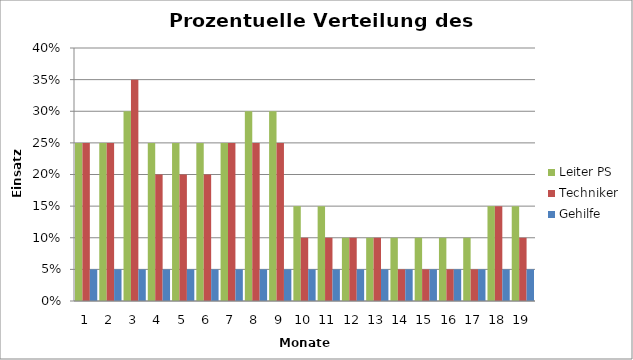
| Category | Leiter PS | Techniker | Gehilfe |
|---|---|---|---|
| 0 | 0.25 | 0.25 | 0.05 |
| 1 | 0.25 | 0.25 | 0.05 |
| 2 | 0.3 | 0.35 | 0.05 |
| 3 | 0.25 | 0.2 | 0.05 |
| 4 | 0.25 | 0.2 | 0.05 |
| 5 | 0.25 | 0.2 | 0.05 |
| 6 | 0.25 | 0.25 | 0.05 |
| 7 | 0.3 | 0.25 | 0.05 |
| 8 | 0.3 | 0.25 | 0.05 |
| 9 | 0.15 | 0.1 | 0.05 |
| 10 | 0.15 | 0.1 | 0.05 |
| 11 | 0.1 | 0.1 | 0.05 |
| 12 | 0.1 | 0.1 | 0.05 |
| 13 | 0.1 | 0.05 | 0.05 |
| 14 | 0.1 | 0.05 | 0.05 |
| 15 | 0.1 | 0.05 | 0.05 |
| 16 | 0.1 | 0.05 | 0.05 |
| 17 | 0.15 | 0.15 | 0.05 |
| 18 | 0.15 | 0.1 | 0.05 |